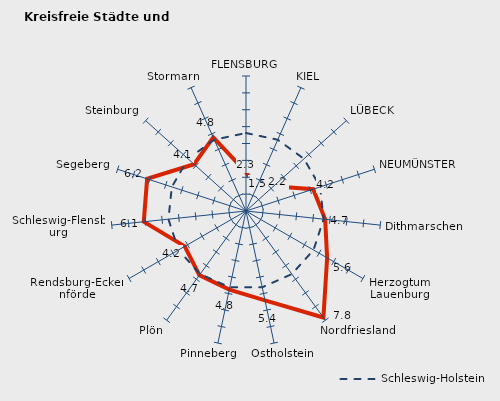
| Category | Kreise | Schleswig-Holstein |
|---|---|---|
| FLENSBURG | 2.301 | 4.622 |
| KIEL | 1.51 | 4.622 |
| LÜBECK | 2.183 | 4.622 |
| NEUMÜNSTER | 4.189 | 4.622 |
| Dithmarschen | 4.717 | 4.622 |
| Herzogtum Lauenburg | 5.552 | 4.622 |
| Nordfriesland | 7.803 | 4.622 |
| Ostholstein | 5.417 | 4.622 |
| Pinneberg | 4.759 | 4.622 |
| Plön | 4.7 | 4.622 |
| Rendsburg-Eckernförde | 4.19 | 4.622 |
| Schleswig-Flensburg | 6.091 | 4.622 |
| Segeberg | 6.162 | 4.622 |
| Steinburg | 4.138 | 4.622 |
| Stormarn | 4.775 | 4.622 |